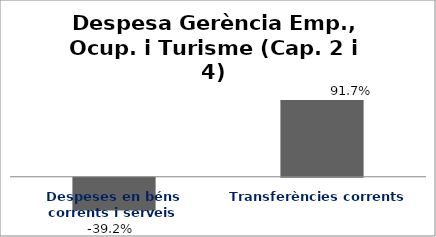
| Category | Series 0 |
|---|---|
| Despeses en béns corrents i serveis | -0.392 |
| Transferències corrents | 0.917 |